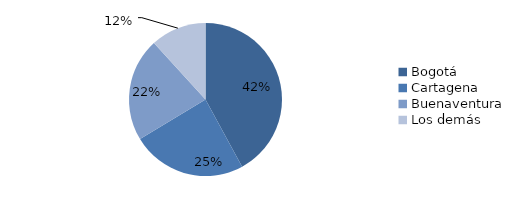
| Category | Series 0 |
|---|---|
| Bogotá | 782.914 |
| Cartagena | 452.193 |
| Buenaventura | 407.396 |
| Los demás | 219.195 |